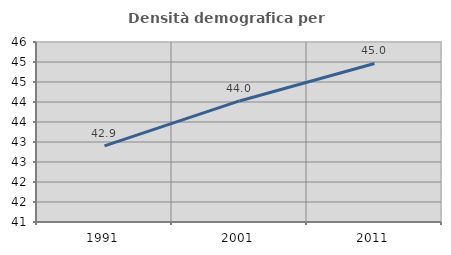
| Category | Densità demografica |
|---|---|
| 1991.0 | 42.901 |
| 2001.0 | 44.026 |
| 2011.0 | 44.964 |